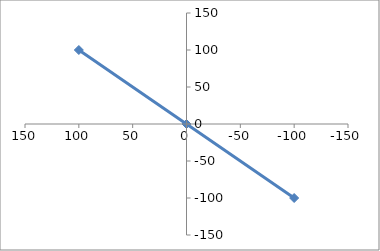
| Category | Series 1 |
|---|---|
| -100.0 | -100 |
| 0.0 | 0 |
| 100.0 | 100 |